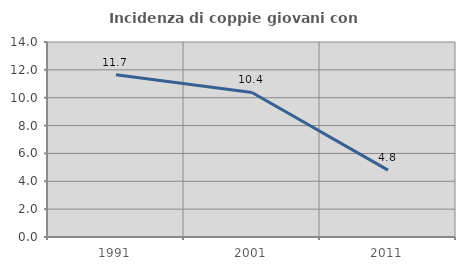
| Category | Incidenza di coppie giovani con figli |
|---|---|
| 1991.0 | 11.653 |
| 2001.0 | 10.375 |
| 2011.0 | 4.802 |